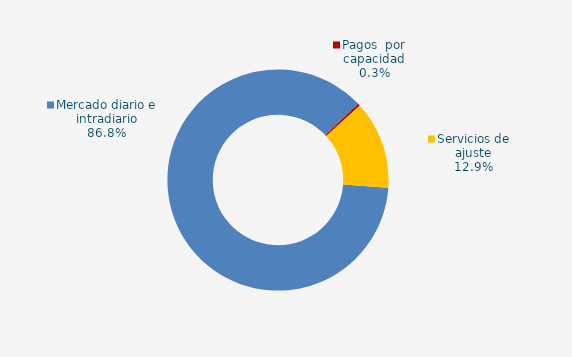
| Category | Series 0 |
|---|---|
| Mercado diario e intradiario | 74.4 |
| Pagos  por capacidad | 0.29 |
| Mecanismo ajuste RD-L 10/2022 | 0 |
| Servicios de ajuste | 11.03 |